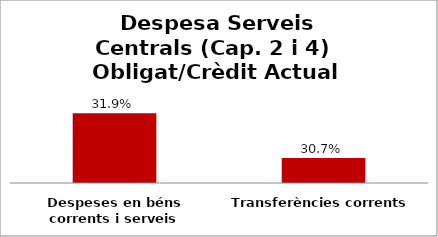
| Category | Series 0 |
|---|---|
| Despeses en béns corrents i serveis | 0.319 |
| Transferències corrents | 0.307 |